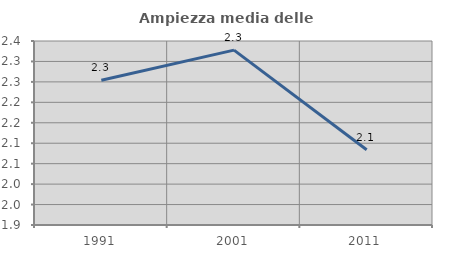
| Category | Ampiezza media delle famiglie |
|---|---|
| 1991.0 | 2.254 |
| 2001.0 | 2.328 |
| 2011.0 | 2.084 |